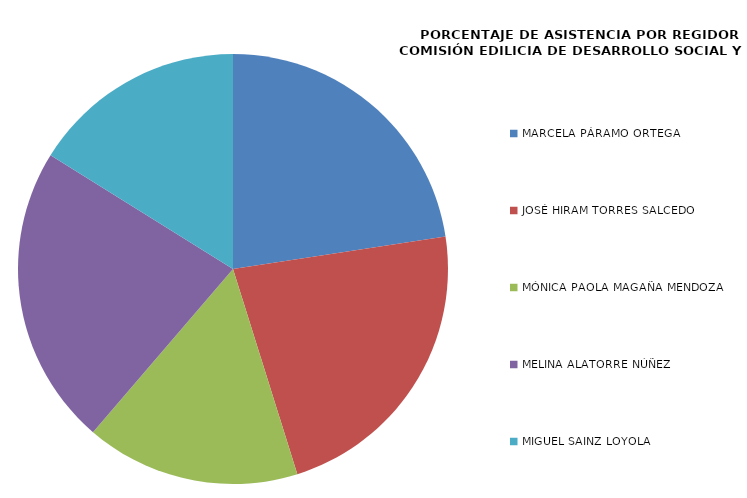
| Category | Series 0 |
|---|---|
| MARCELA PÁRAMO ORTEGA | 100 |
| JOSÉ HIRAM TORRES SALCEDO | 100 |
| MÓNICA PAOLA MAGAÑA MENDOZA | 71.429 |
| MELINA ALATORRE NÚÑEZ | 100 |
| MIGUEL SAINZ LOYOLA | 71.429 |